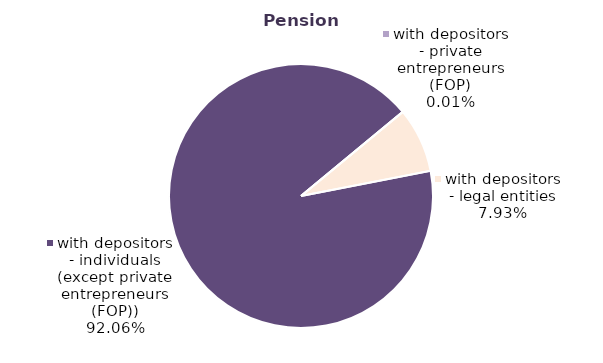
| Category | Series 0 |
|---|---|
| with depositors - individuals (except private entrepreneurs (FOP)) | 62061 |
| with depositors - private entrepreneurs (FOP) | 8 |
| with depositors - legal entities | 5346 |